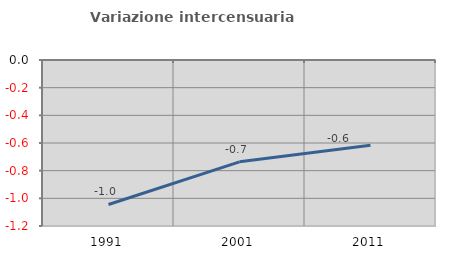
| Category | Variazione intercensuaria annua |
|---|---|
| 1991.0 | -1.044 |
| 2001.0 | -0.736 |
| 2011.0 | -0.617 |